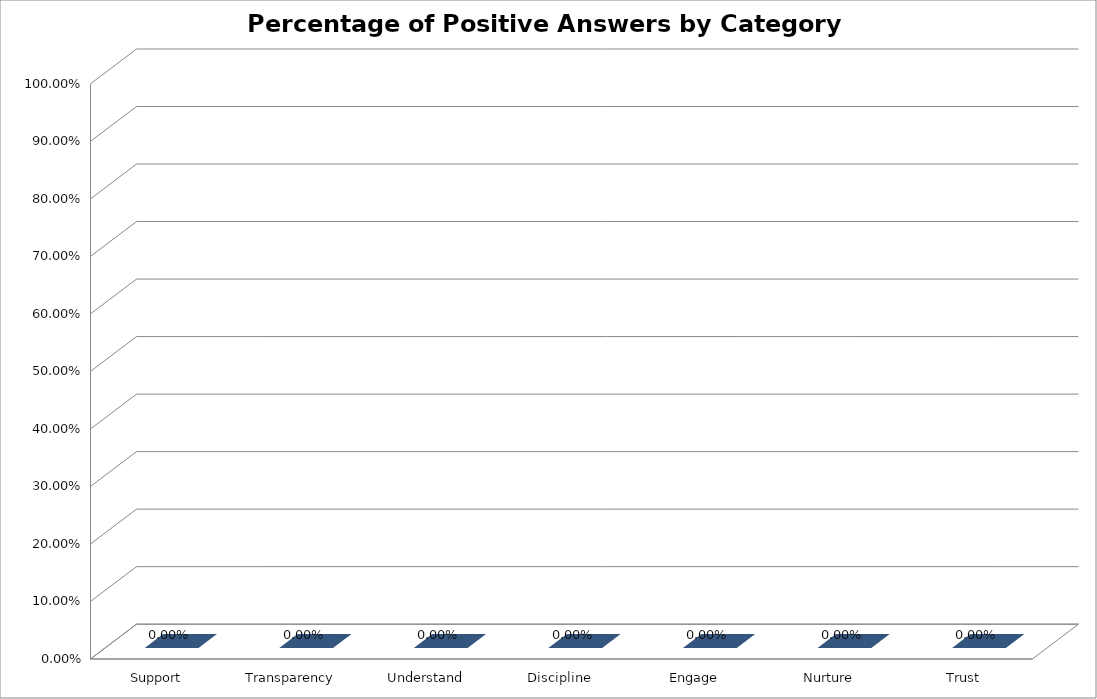
| Category | Series 0 |
|---|---|
| Support | 0 |
| Transparency | 0 |
| Understand | 0 |
| Discipline | 0 |
| Engage | 0 |
| Nurture | 0 |
| Trust | 0 |